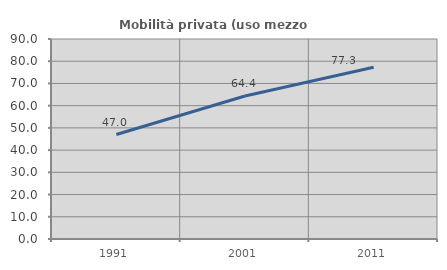
| Category | Mobilità privata (uso mezzo privato) |
|---|---|
| 1991.0 | 47.01 |
| 2001.0 | 64.364 |
| 2011.0 | 77.314 |